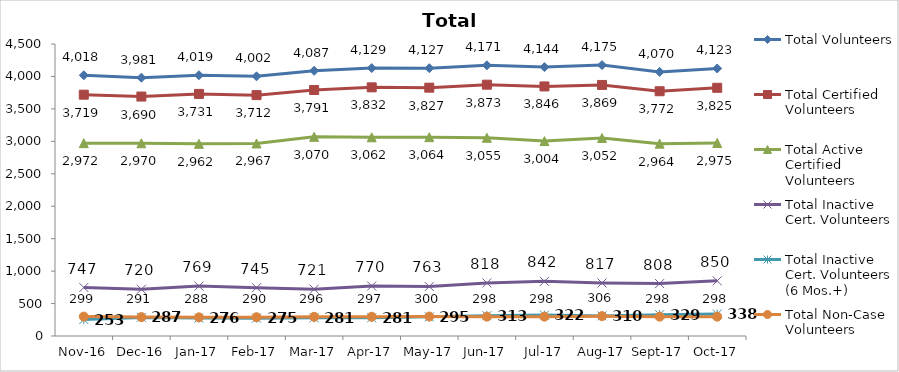
| Category | Total Volunteers | Total Certified Volunteers | Total Active Certified Volunteers | Total Inactive Cert. Volunteers | Total Inactive Cert. Volunteers (6 Mos.+) | Total Non-Case Volunteers |
|---|---|---|---|---|---|---|
| 2016-11-01 | 4018 | 3719 | 2972 | 747 | 253 | 299 |
| 2016-12-01 | 3981 | 3690 | 2970 | 720 | 287 | 291 |
| 2017-01-01 | 4019 | 3731 | 2962 | 769 | 276 | 288 |
| 2017-02-01 | 4002 | 3712 | 2967 | 745 | 275 | 290 |
| 2017-03-01 | 4087 | 3791 | 3070 | 721 | 281 | 296 |
| 2017-04-01 | 4129 | 3832 | 3062 | 770 | 281 | 297 |
| 2017-05-01 | 4127 | 3827 | 3064 | 763 | 295 | 300 |
| 2017-06-01 | 4171 | 3873 | 3055 | 818 | 313 | 298 |
| 2017-07-01 | 4144 | 3846 | 3004 | 842 | 322 | 298 |
| 2017-08-01 | 4175 | 3869 | 3052 | 817 | 310 | 306 |
| 2017-09-01 | 4070 | 3772 | 2964 | 808 | 329 | 298 |
| 2017-10-01 | 4123 | 3825 | 2975 | 850 | 338 | 298 |